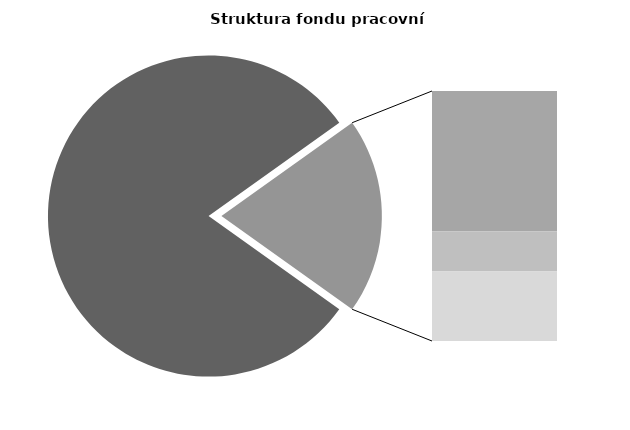
| Category | Series 0 |
|---|---|
| Průměrná měsíční odpracovaná doba bez přesčasu | 138.333 |
| Dovolená | 19.07 |
| Nemoc | 5.482 |
| Jiné | 9.449 |